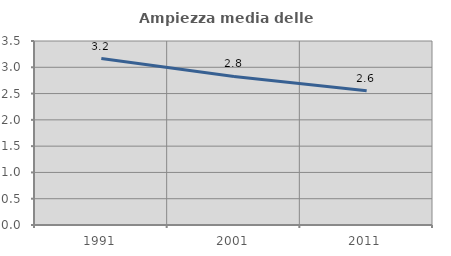
| Category | Ampiezza media delle famiglie |
|---|---|
| 1991.0 | 3.166 |
| 2001.0 | 2.826 |
| 2011.0 | 2.553 |